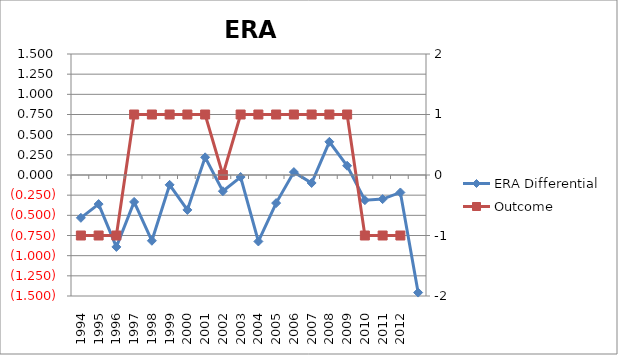
| Category | ERA Differential |
|---|---|
| 1994.0 | -0.531 |
| 1995.0 | -0.36 |
| 1996.0 | -0.892 |
| 1997.0 | -0.333 |
| 1998.0 | -0.815 |
| 1999.0 | -0.122 |
| 2000.0 | -0.433 |
| 2001.0 | 0.219 |
| 2002.0 | -0.201 |
| 2003.0 | -0.025 |
| 2004.0 | -0.824 |
| 2005.0 | -0.348 |
| 2006.0 | 0.036 |
| 2007.0 | -0.099 |
| 2008.0 | 0.411 |
| 2009.0 | 0.115 |
| 2010.0 | -0.312 |
| 2011.0 | -0.299 |
| 2012.0 | -0.217 |